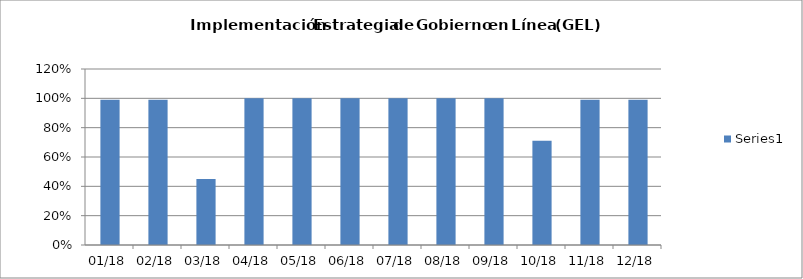
| Category | Series 0 |
|---|---|
| 2018-01-01 | 0.99 |
| 2018-02-01 | 0.99 |
| 2018-03-01 | 0.45 |
| 2018-04-01 | 1 |
| 2018-05-01 | 1 |
| 2018-06-01 | 1 |
| 2018-07-01 | 1 |
| 2018-08-01 | 1 |
| 2018-09-01 | 1 |
| 2018-10-01 | 0.71 |
| 2018-11-01 | 0.99 |
| 2018-12-01 | 0.99 |